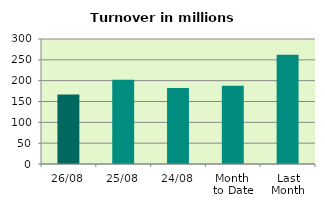
| Category | Series 0 |
|---|---|
| 26/08 | 166.883 |
| 25/08 | 201.966 |
| 24/08 | 182.584 |
| Month 
to Date | 187.538 |
| Last
Month | 262.308 |